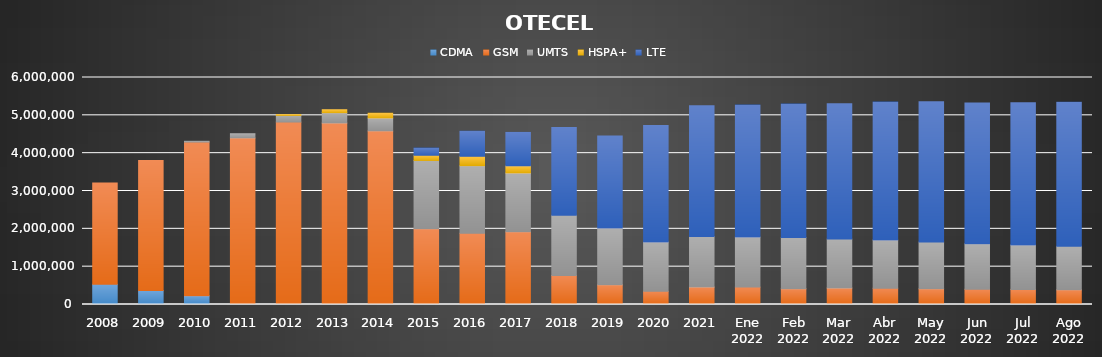
| Category | CDMA | GSM | UMTS | HSPA+ | LTE |
|---|---|---|---|---|---|
| 2008 | 533206 | 2678716 | 0 | 0 | 0 |
| 2009 | 370711 | 3435721 | 0 | 0 | 0 |
| 2010 | 232396 | 4061909 | 20294 | 0 | 0 |
| 2011 | 0 | 4403305 | 110569 | 0 | 0 |
| 2012 | 0 | 4823675 | 174375 | 21636 | 0 |
| 2013 | 0 | 4797632 | 272871 | 77805 | 0 |
| 2014 | 0 | 4589205 | 341647 | 124793 | 0 |
| 2015 | 0 | 2002436 | 1805322 | 136952 | 189988 |
| 2016 | 0 | 1881781 | 1787014 | 248541 | 662756 |
| 2017 | 0 | 1924184.634 | 1552693.066 | 187515.199 | 884631.101 |
| 2018 | 0 | 765658.891 | 1596404.415 | 0 | 2317582.694 |
| 2019 | 0 | 525011.505 | 1498097.705 | 0 | 2433246.79 |
| 2020 | 0 | 348601.621 | 1305745.099 | 0 | 3075378.28 |
| 2021 | 0 | 463116 | 1335075 | 0 | 3456277 |
| Ene 2022 | 0 | 461271.915 | 1324789.367 | 0 | 3486728.718 |
| Feb 2022 | 0 | 419568.449 | 1353562.987 | 0 | 3524816.564 |
| Mar 2022 | 0 | 438224.686 | 1291201.748 | 0 | 3579803.566 |
| Abr 2022 | 0 | 431954.615 | 1274369.387 | 0 | 3643464.999 |
| May 2022 | 0 | 416835.41 | 1233843.984 | 0 | 3707652.607 |
| Jun 2022 | 0 | 404442.897 | 1201100.892 | 0 | 3721062.21 |
| Jul 2022 | 0 | 398450.905 | 1177412.14 | 0 | 3758364.955 |
| Ago 2022 | 0 | 389926.74 | 1151449.27 | 0 | 3804394.989 |